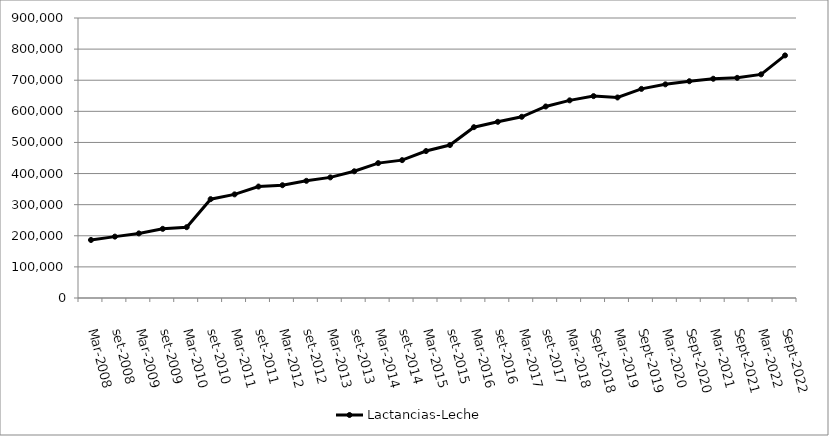
| Category | Lactancias-Leche  |
|---|---|
| mar-2008 | 186528 |
| set-2008 | 197292 |
| mar-2009 | 207648 |
| set-2009 | 222353 |
| mar-2010 | 227619 |
| set-2010 | 317718 |
| mar-2011 | 333095 |
| set-2011 | 358254 |
| mar-2012 | 362509 |
| set-2012 | 376620 |
| mar-2013 | 387638 |
| set-2013 | 407294 |
| mar-2014 | 433571 |
| set-2014 | 443114 |
| mar-2015 | 472333 |
| set-2015 | 491728 |
| mar-2016 | 549068 |
| set-2016 | 566338 |
| mar-2017 | 582470 |
| set-2017 | 615581 |
| mar-2018 | 635290 |
| sep-2018 | 648922 |
| mar-2019 | 644563 |
| sep-2019 | 672128 |
| mar-2020 | 686726 |
| sep-2020 | 696775 |
| mar-2021 | 704719 |
| sep-2021 | 707612 |
| mar-2022 | 718823 |
| sep-2022 | 779709 |